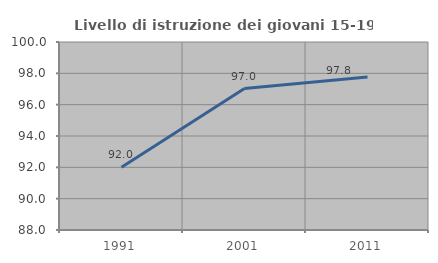
| Category | Livello di istruzione dei giovani 15-19 anni |
|---|---|
| 1991.0 | 92 |
| 2001.0 | 97.03 |
| 2011.0 | 97.761 |